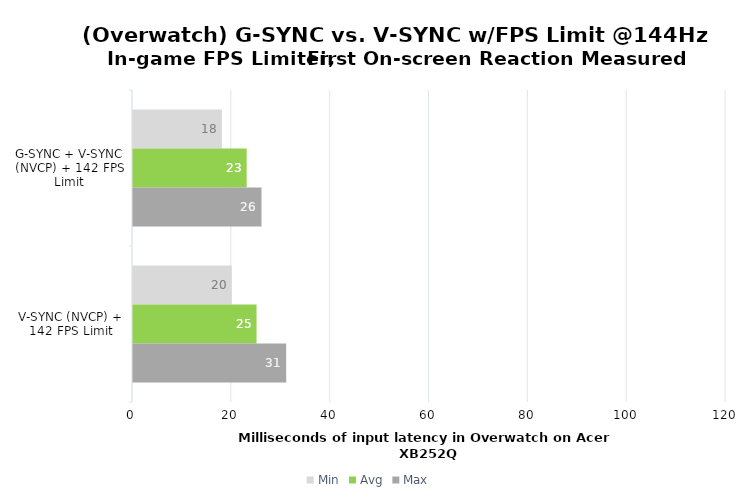
| Category | Min | Avg | Max |
|---|---|---|---|
| G-SYNC + V-SYNC (NVCP) + 142 FPS Limit | 18 | 23 | 26 |
| V-SYNC (NVCP) + 142 FPS Limit | 20 | 25 | 31 |